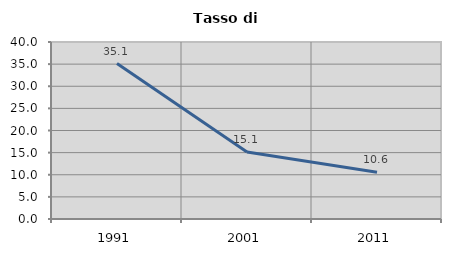
| Category | Tasso di disoccupazione   |
|---|---|
| 1991.0 | 35.127 |
| 2001.0 | 15.124 |
| 2011.0 | 10.577 |